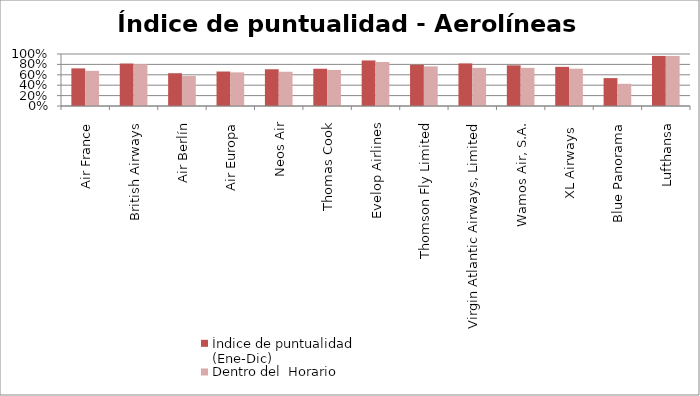
| Category | Índice de puntualidad
(Ene-Dic) | Dentro del  Horario |
|---|---|---|
| Air France | 0.724 | 0.676 |
| British Airways | 0.816 | 0.804 |
| Air Berlín | 0.63 | 0.576 |
| Air Europa | 0.663 | 0.647 |
| Neos Air | 0.706 | 0.659 |
| Thomas Cook | 0.717 | 0.693 |
| Evelop Airlines | 0.876 | 0.847 |
| Thomson Fly Limited | 0.794 | 0.762 |
| Virgin Atlantic Airways, Limited | 0.819 | 0.733 |
| Wamos Air, S.A. | 0.782 | 0.733 |
| XL Airways  | 0.753 | 0.718 |
| Blue Panorama | 0.536 | 0.427 |
| Lufthansa | 0.963 | 0.963 |